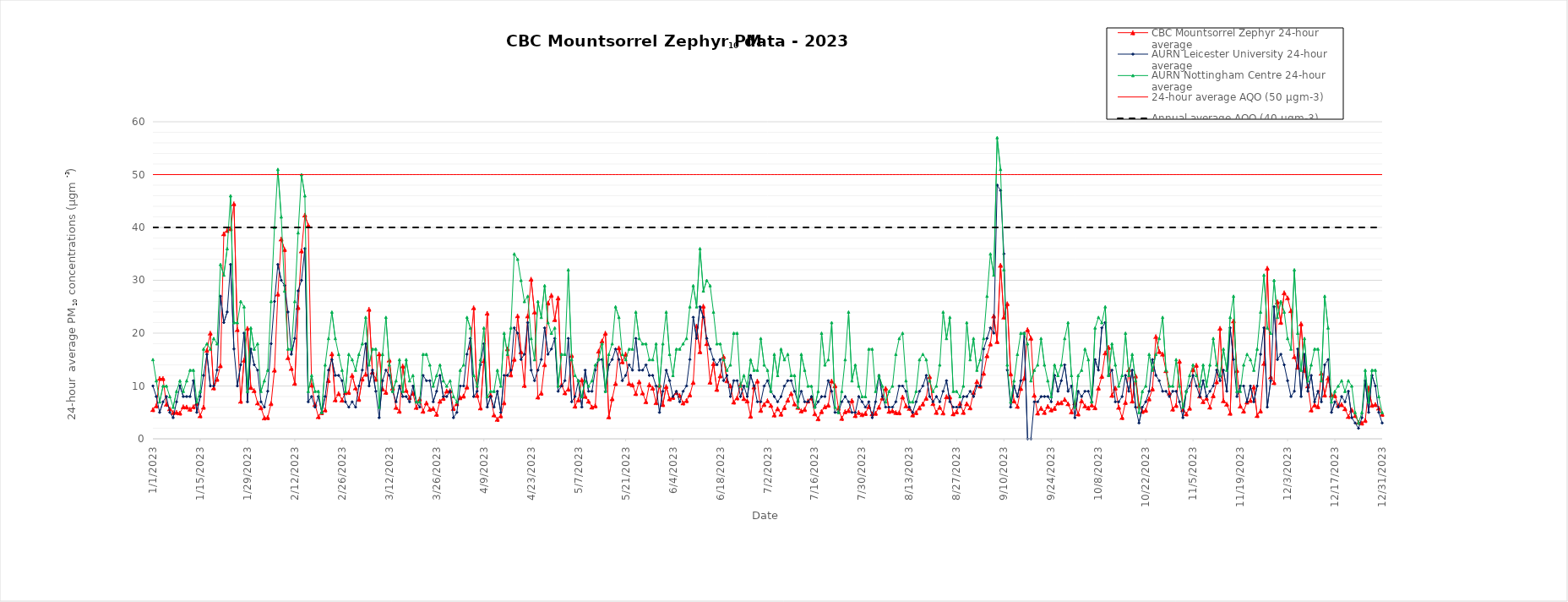
| Category | CBC Mountsorrel Zephyr 24-hour average | AURN Leicester University 24-hour average | AURN Nottingham Centre 24-hour average | 24-hour average AQO (50 µgm-3) | Annual average AQO (40 µgm-3) |
|---|---|---|---|---|---|
| 1/1/23 | 5.53 | 10 | 15 | 50 | 40 |
| 1/2/23 | 6.25 | 8 | 11 | 50 | 40 |
| 1/3/23 | 11.44 | 5 | 7 | 50 | 40 |
| 1/4/23 | 11.42 | 7 | 10 | 50 | 40 |
| 1/5/23 | 6.55 | 8 | 10 | 50 | 40 |
| 1/6/23 | 5.69 | 5 | 8 | 50 | 40 |
| 1/7/23 | 4.98 | 4 | 6 | 50 | 40 |
| 1/8/23 | 5.01 | 7 | 9 | 50 | 40 |
| 1/9/23 | 4.88 | 10 | 11 | 50 | 40 |
| 1/10/23 | 6.07 | 8 | 9 | 50 | 40 |
| 1/11/23 | 6.02 | 8 | 11 | 50 | 40 |
| 1/12/23 | 5.62 | 8 | 13 | 50 | 40 |
| 1/13/23 | 6.07 | 11 | 13 | 50 | 40 |
| 1/14/23 | 6.75 | 5 | 7 | 50 | 40 |
| 1/15/23 | 4.38 | 8 | 9 | 50 | 40 |
| 1/16/23 | 5.99 | 12 | 17 | 50 | 40 |
| 1/17/23 | 16.75 | 16 | 18 | 50 | 40 |
| 1/18/23 | 20 | 10 | 17 | 50 | 40 |
| 1/19/23 | 9.65 | 10 | 19 | 50 | 40 |
| 1/20/23 | 11.28 | 13 | 18 | 50 | 40 |
| 1/21/23 | 13.85 | 27 | 33 | 50 | 40 |
| 1/22/23 | 38.8 | 22 | 31 | 50 | 40 |
| 1/23/23 | 39.44 | 24 | 36 | 50 | 40 |
| 1/24/23 | 39.76 | 33 | 46 | 50 | 40 |
| 1/25/23 | 44.48 | 17 | 22 | 50 | 40 |
| 1/26/23 | 20.67 | 10 | 22 | 50 | 40 |
| 1/27/23 | 7.11 | 14 | 26 | 50 | 40 |
| 1/28/23 | 14.89 | 20 | 25 | 50 | 40 |
| 1/29/23 | 20.91 | 7 | 9 | 50 | 40 |
| 1/30/23 | 9.73 | 17 | 21 | 50 | 40 |
| 1/31/23 | 9.12 | 14 | 17 | 50 | 40 |
| 2/1/23 | 6.79 | 13 | 18 | 50 | 40 |
| 2/2/23 | 5.89 | 7 | 9 | 50 | 40 |
| 2/3/23 | 3.97 | 6 | 11 | 50 | 40 |
| 2/4/23 | 4.03 | 9 | 13 | 50 | 40 |
| 2/5/23 | 6.68 | 18 | 26 | 50 | 40 |
| 2/6/23 | 13.01 | 26 | 40 | 50 | 40 |
| 2/7/23 | 27.4 | 33 | 51 | 50 | 40 |
| 2/8/23 | 37.82 | 30 | 42 | 50 | 40 |
| 2/9/23 | 35.82 | 29 | 28 | 50 | 40 |
| 2/10/23 | 15.36 | 24 | 17 | 50 | 40 |
| 2/11/23 | 13.33 | 16 | 17 | 50 | 40 |
| 2/12/23 | 10.51 | 19 | 26 | 50 | 40 |
| 2/13/23 | 24.87 | 28 | 39 | 50 | 40 |
| 2/14/23 | 35.57 | 30 | 50 | 50 | 40 |
| 2/15/23 | 42.34 | 36 | 46 | 50 | 40 |
| 2/16/23 | 40.42 | 7 | 9 | 50 | 40 |
| 2/17/23 | 10.17 | 8 | 12 | 50 | 40 |
| 2/18/23 | 6.52 | 6 | 9 | 50 | 40 |
| 2/19/23 | 4.2 | 8 | 9 | 50 | 40 |
| 2/20/23 | 4.96 | 5 | 5 | 50 | 40 |
| 2/21/23 | 5.48 | 8 | 14 | 50 | 40 |
| 2/22/23 | 11.04 | 13 | 19 | 50 | 40 |
| 2/23/23 | 16.09 | 15 | 24 | 50 | 40 |
| 2/24/23 | 7.39 | 12 | 19 | 50 | 40 |
| 2/25/23 | 8.57 | 12 | 16 | 50 | 40 |
| 2/26/23 | 7.34 | 11 | 13 | 50 | 40 |
| 2/27/23 | 8.75 | 7 | 9 | 50 | 40 |
| 2/28/23 | 8.79 | 6 | 16 | 50 | 40 |
| 3/1/23 | 12.01 | 7 | 15 | 50 | 40 |
| 3/2/23 | 9.64 | 6 | 13 | 50 | 40 |
| 3/3/23 | 7.48 | 10 | 16 | 50 | 40 |
| 3/4/23 | 11.32 | 13 | 18 | 50 | 40 |
| 3/5/23 | 12.23 | 18 | 23 | 50 | 40 |
| 3/6/23 | 24.52 | 10 | 14 | 50 | 40 |
| 3/7/23 | 12.65 | 13 | 17 | 50 | 40 |
| 3/8/23 | 11.29 | 9 | 17 | 50 | 40 |
| 3/9/23 | 16.07 | 4 | 6 | 50 | 40 |
| 3/10/23 | 9.47 | 11 | 16 | 50 | 40 |
| 3/11/23 | 8.81 | 13 | 23 | 50 | 40 |
| 3/12/23 | 14.9 | 12 | 14 | 50 | 40 |
| 3/13/23 | 9.61 | 9 | 9 | 50 | 40 |
| 3/14/23 | 5.96 | 7 | 11 | 50 | 40 |
| 3/15/23 | 5.23 | 10 | 15 | 50 | 40 |
| 3/16/23 | 13.78 | 8 | 9 | 50 | 40 |
| 3/17/23 | 9.17 | 8 | 15 | 50 | 40 |
| 3/18/23 | 7.81 | 7 | 11 | 50 | 40 |
| 3/19/23 | 8.62 | 10 | 12 | 50 | 40 |
| 3/20/23 | 5.96 | 7 | 7 | 50 | 40 |
| 3/21/23 | 7.54 | 6 | 7 | 50 | 40 |
| 3/22/23 | 5.23 | 12 | 16 | 50 | 40 |
| 3/23/23 | 6.81 | 11 | 16 | 50 | 40 |
| 3/24/23 | 5.59 | 11 | 14 | 50 | 40 |
| 3/25/23 | 5.74 | 7 | 10 | 50 | 40 |
| 3/26/23 | 4.66 | 9 | 12 | 50 | 40 |
| 3/27/23 | 7.13 | 12 | 14 | 50 | 40 |
| 3/28/23 | 7.66 | 8 | 11 | 50 | 40 |
| 3/29/23 | 9.06 | 8 | 10 | 50 | 40 |
| 3/30/23 | 9.1 | 9 | 11 | 50 | 40 |
| 3/31/23 | 5.75 | 4 | 8 | 50 | 40 |
| 4/1/23 | 6.66 | 5 | 7 | 50 | 40 |
| 4/2/23 | 7.8 | 10 | 13 | 50 | 40 |
| 4/3/23 | 8.1 | 10 | 14 | 50 | 40 |
| 4/4/23 | 9.82 | 16 | 23 | 50 | 40 |
| 4/5/23 | 17.27 | 19 | 21 | 50 | 40 |
| 4/6/23 | 24.8 | 8 | 12 | 50 | 40 |
| 4/7/23 | 8.22 | 9 | 10 | 50 | 40 |
| 4/8/23 | 5.85 | 14 | 15 | 50 | 40 |
| 4/9/23 | 14.76 | 18 | 21 | 50 | 40 |
| 4/10/23 | 23.76 | 6 | 8 | 50 | 40 |
| 4/11/23 | 8.28 | 8 | 9 | 50 | 40 |
| 4/12/23 | 4.54 | 6 | 9 | 50 | 40 |
| 4/13/23 | 3.7 | 9 | 13 | 50 | 40 |
| 4/14/23 | 4.35 | 5 | 10 | 50 | 40 |
| 4/15/23 | 6.83 | 12 | 20 | 50 | 40 |
| 4/16/23 | 17.04 | 12 | 16 | 50 | 40 |
| 4/17/23 | 12.11 | 13 | 21 | 50 | 40 |
| 4/18/23 | 15.08 | 21 | 35 | 50 | 40 |
| 4/19/23 | 23.27 | 20 | 34 | 50 | 40 |
| 4/20/23 | 16.49 | 15 | 30 | 50 | 40 |
| 4/21/23 | 10.12 | 16 | 26 | 50 | 40 |
| 4/22/23 | 23.26 | 22 | 27 | 50 | 40 |
| 4/23/23 | 30.21 | 13 | 19 | 50 | 40 |
| 4/24/23 | 23.99 | 11 | 15 | 50 | 40 |
| 4/25/23 | 7.91 | 13 | 26 | 50 | 40 |
| 4/26/23 | 8.66 | 15 | 23 | 50 | 40 |
| 4/27/23 | 14.04 | 21 | 29 | 50 | 40 |
| 4/28/23 | 25.71 | 16 | 22 | 50 | 40 |
| 4/29/23 | 27.17 | 17 | 20 | 50 | 40 |
| 4/30/23 | 22.58 | 19 | 21 | 50 | 40 |
| 5/1/23 | 26.66 | 9 | 10 | 50 | 40 |
| 5/2/23 | 10.23 | 10 | 16 | 50 | 40 |
| 5/3/23 | 8.71 | 11 | 16 | 50 | 40 |
| 5/4/23 | 9.4 | 19 | 32 | 50 | 40 |
| 5/5/23 | 15.78 | 7 | 15 | 50 | 40 |
| 5/6/23 | 6.19 | 8 | 12 | 50 | 40 |
| 5/7/23 | 7.39 | 11 | 11 | 50 | 40 |
| 5/8/23 | 11.18 | 6 | 8 | 50 | 40 |
| 5/9/23 | 8.06 | 13 | 11 | 50 | 40 |
| 5/10/23 | 7.12 | 9 | 10 | 50 | 40 |
| 5/11/23 | 6.02 | 9 | 11 | 50 | 40 |
| 5/12/23 | 6.26 | 13 | 14 | 50 | 40 |
| 5/13/23 | 16.59 | 15 | 15 | 50 | 40 |
| 5/14/23 | 18.51 | 15 | 18 | 50 | 40 |
| 5/15/23 | 19.99 | 9 | 9 | 50 | 40 |
| 5/16/23 | 4.17 | 14 | 16 | 50 | 40 |
| 5/17/23 | 7.59 | 15 | 18 | 50 | 40 |
| 5/18/23 | 10.47 | 17 | 25 | 50 | 40 |
| 5/19/23 | 17.22 | 15 | 23 | 50 | 40 |
| 5/20/23 | 14.59 | 11 | 16 | 50 | 40 |
| 5/21/23 | 16.04 | 12 | 15 | 50 | 40 |
| 5/22/23 | 10.48 | 14 | 17 | 50 | 40 |
| 5/23/23 | 10.21 | 13 | 17 | 50 | 40 |
| 5/24/23 | 8.58 | 19 | 24 | 50 | 40 |
| 5/25/23 | 10.81 | 13 | 19 | 50 | 40 |
| 5/26/23 | 8.69 | 13 | 18 | 50 | 40 |
| 5/27/23 | 7.03 | 14 | 18 | 50 | 40 |
| 5/28/23 | 10.25 | 12 | 15 | 50 | 40 |
| 5/29/23 | 9.6 | 12 | 15 | 50 | 40 |
| 5/30/23 | 6.86 | 10 | 18 | 50 | 40 |
| 5/31/23 | 10.15 | 5 | 10 | 50 | 40 |
| 6/1/23 | 6.49 | 9 | 18 | 50 | 40 |
| 6/2/23 | 9.9 | 13 | 24 | 50 | 40 |
| 6/3/23 | 7.58 | 11 | 16 | 50 | 40 |
| 6/4/23 | 7.85 | 8 | 12 | 50 | 40 |
| 6/5/23 | 8.77 | 9 | 17 | 50 | 40 |
| 6/6/23 | 8.22 | 7 | 17 | 50 | 40 |
| 6/7/23 | 6.79 | 9 | 18 | 50 | 40 |
| 6/8/23 | 7.24 | 10 | 19 | 50 | 40 |
| 6/9/23 | 8.32 | 15 | 25 | 50 | 40 |
| 6/10/23 | 10.68 | 23 | 29 | 50 | 40 |
| 6/11/23 | 21.33 | 19 | 25 | 50 | 40 |
| 6/12/23 | 16.5 | 25 | 36 | 50 | 40 |
| 6/13/23 | 25.1 | 23 | 28 | 50 | 40 |
| 6/14/23 | 18.02 | 19 | 30 | 50 | 40 |
| 6/15/23 | 10.73 | 17 | 29 | 50 | 40 |
| 6/16/23 | 14.24 | 15 | 24 | 50 | 40 |
| 6/17/23 | 9.36 | 14 | 18 | 50 | 40 |
| 6/18/23 | 11.93 | 15 | 18 | 50 | 40 |
| 6/19/23 | 15.56 | 11 | 15 | 50 | 40 |
| 6/20/23 | 10.99 | 12 | 13 | 50 | 40 |
| 6/21/23 | 10.05 | 8 | 14 | 50 | 40 |
| 6/22/23 | 6.96 | 11 | 20 | 50 | 40 |
| 6/23/23 | 7.75 | 11 | 20 | 50 | 40 |
| 6/24/23 | 10.29 | 8 | 10 | 50 | 40 |
| 6/25/23 | 7.62 | 10 | 12 | 50 | 40 |
| 6/26/23 | 7.17 | 8 | 10 | 50 | 40 |
| 6/27/23 | 4.28 | 12 | 15 | 50 | 40 |
| 6/28/23 | 9.81 | 10 | 13 | 50 | 40 |
| 6/29/23 | 10.94 | 7 | 13 | 50 | 40 |
| 6/30/23 | 5.39 | 7 | 19 | 50 | 40 |
| 7/1/23 | 6.51 | 10 | 14 | 50 | 40 |
| 7/2/23 | 7.21 | 11 | 13 | 50 | 40 |
| 7/3/23 | 6.32 | 9 | 9 | 50 | 40 |
| 7/4/23 | 4.52 | 8 | 16 | 50 | 40 |
| 7/5/23 | 5.7 | 7 | 12 | 50 | 40 |
| 7/6/23 | 4.68 | 8 | 17 | 50 | 40 |
| 7/7/23 | 5.93 | 10 | 15 | 50 | 40 |
| 7/8/23 | 7.33 | 11 | 16 | 50 | 40 |
| 7/9/23 | 8.57 | 11 | 12 | 50 | 40 |
| 7/10/23 | 6.62 | 9 | 12 | 50 | 40 |
| 7/11/23 | 5.97 | 7 | 6 | 50 | 40 |
| 7/12/23 | 5.29 | 9 | 16 | 50 | 40 |
| 7/13/23 | 5.56 | 7 | 13 | 50 | 40 |
| 7/14/23 | 7.17 | 7 | 10 | 50 | 40 |
| 7/15/23 | 7.71 | 8 | 10 | 50 | 40 |
| 7/16/23 | 4.76 | 6 | 6 | 50 | 40 |
| 7/17/23 | 3.81 | 7 | 9 | 50 | 40 |
| 7/18/23 | 5.17 | 8 | 20 | 50 | 40 |
| 7/19/23 | 6.07 | 8 | 14 | 50 | 40 |
| 7/20/23 | 6.38 | 11 | 15 | 50 | 40 |
| 7/21/23 | 10.95 | 9 | 22 | 50 | 40 |
| 7/22/23 | 10.05 | 5 | 6 | 50 | 40 |
| 7/23/23 | 5.8 | 5 | 5 | 50 | 40 |
| 7/24/23 | 3.87 | 7 | 9 | 50 | 40 |
| 7/25/23 | 5.15 | 8 | 15 | 50 | 40 |
| 7/26/23 | 5.35 | 7 | 24 | 50 | 40 |
| 7/27/23 | 7.25 | 5 | 11 | 50 | 40 |
| 7/28/23 | 4.4 | 5 | 14 | 50 | 40 |
| 7/29/23 | 4.99 | 8 | 10 | 50 | 40 |
| 7/30/23 | 4.59 | 7 | 8 | 50 | 40 |
| 7/31/23 | 4.81 | 6 | 8 | 50 | 40 |
| 8/1/23 | 6.11 | 7 | 17 | 50 | 40 |
| 8/2/23 | 4.73 | 4 | 17 | 50 | 40 |
| 8/3/23 | 4.83 | 7 | 9 | 50 | 40 |
| 8/4/23 | 6 | 12 | 12 | 50 | 40 |
| 8/5/23 | 7.73 | 8 | 10 | 50 | 40 |
| 8/6/23 | 9.55 | 6 | 7 | 50 | 40 |
| 8/7/23 | 5.21 | 6 | 9 | 50 | 40 |
| 8/8/23 | 5.31 | 6 | 10 | 50 | 40 |
| 8/9/23 | 4.98 | 7 | 16 | 50 | 40 |
| 8/10/23 | 4.94 | 10 | 19 | 50 | 40 |
| 8/11/23 | 7.91 | 10 | 20 | 50 | 40 |
| 8/12/23 | 6.23 | 9 | 11 | 50 | 40 |
| 8/13/23 | 5.75 | 6 | 7 | 50 | 40 |
| 8/14/23 | 4.54 | 5 | 7 | 50 | 40 |
| 8/15/23 | 4.96 | 7 | 9 | 50 | 40 |
| 8/16/23 | 5.87 | 9 | 15 | 50 | 40 |
| 8/17/23 | 6.62 | 10 | 16 | 50 | 40 |
| 8/18/23 | 7.7 | 12 | 15 | 50 | 40 |
| 8/19/23 | 11.78 | 8 | 11 | 50 | 40 |
| 8/20/23 | 6.68 | 7 | 9 | 50 | 40 |
| 8/21/23 | 5.02 | 8 | 10 | 50 | 40 |
| 8/22/23 | 5.98 | 7 | 14 | 50 | 40 |
| 8/23/23 | 4.91 | 9 | 24 | 50 | 40 |
| 8/24/23 | 7.98 | 11 | 19 | 50 | 40 |
| 8/25/23 | 7.92 | 7 | 23 | 50 | 40 |
| 8/26/23 | 4.74 | 6 | 9 | 50 | 40 |
| 8/27/23 | 5.12 | 6 | 9 | 50 | 40 |
| 8/28/23 | 6.71 | 6 | 8 | 50 | 40 |
| 8/29/23 | 5.02 | 8 | 10 | 50 | 40 |
| 8/30/23 | 6.65 | 8 | 22 | 50 | 40 |
| 8/31/23 | 5.88 | 9 | 15 | 50 | 40 |
| 9/1/23 | 8.75 | 8 | 19 | 50 | 40 |
| 9/2/23 | 10.84 | 10 | 13 | 50 | 40 |
| 9/3/23 | 9.99 | 10 | 15 | 50 | 40 |
| 9/4/23 | 12.41 | 17 | 19 | 50 | 40 |
| 9/5/23 | 15.74 | 19 | 27 | 50 | 40 |
| 9/6/23 | 17.96 | 21 | 35 | 50 | 40 |
| 9/7/23 | 23.26 | 20 | 31 | 50 | 40 |
| 9/8/23 | 18.41 | 48 | 57 | 50 | 40 |
| 9/9/23 | 32.85 | 47 | 51 | 50 | 40 |
| 9/10/23 | 23.04 | 35 | 32 | 50 | 40 |
| 9/11/23 | 25.57 | 13 | 14 | 50 | 40 |
| 9/12/23 | 12.29 | 6 | 7 | 50 | 40 |
| 9/13/23 | 7.18 | 10 | 11 | 50 | 40 |
| 9/14/23 | 6.15 | 8 | 16 | 50 | 40 |
| 9/15/23 | 9.54 | 11 | 20 | 50 | 40 |
| 9/16/23 | 11.47 | 20 | 20 | 50 | 40 |
| 9/17/23 | 20.66 | 0 | 18 | 50 | 40 |
| 9/18/23 | 19.05 | 0 | 11 | 50 | 40 |
| 9/19/23 | 8.24 | 7 | 13 | 50 | 40 |
| 9/20/23 | 4.89 | 7 | 14 | 50 | 40 |
| 9/21/23 | 5.79 | 8 | 19 | 50 | 40 |
| 9/22/23 | 5.01 | 8 | 14 | 50 | 40 |
| 9/23/23 | 6.15 | 8 | 11 | 50 | 40 |
| 9/24/23 | 5.49 | 7 | 8 | 50 | 40 |
| 9/25/23 | 5.77 | 12 | 14 | 50 | 40 |
| 9/26/23 | 6.81 | 9 | 12 | 50 | 40 |
| 9/27/23 | 6.84 | 11 | 14 | 50 | 40 |
| 9/28/23 | 7.46 | 14 | 19 | 50 | 40 |
| 9/29/23 | 6.64 | 9 | 22 | 50 | 40 |
| 9/30/23 | 5.11 | 10 | 12 | 50 | 40 |
| 10/1/23 | 6.83 | 4 | 6 | 50 | 40 |
| 10/2/23 | 4.71 | 9 | 12 | 50 | 40 |
| 10/3/23 | 7.2 | 8 | 13 | 50 | 40 |
| 10/4/23 | 6.23 | 9 | 17 | 50 | 40 |
| 10/5/23 | 5.84 | 9 | 15 | 50 | 40 |
| 10/6/23 | 6.4 | 7 | 7 | 50 | 40 |
| 10/7/23 | 5.9 | 15 | 21 | 50 | 40 |
| 10/8/23 | 9.61 | 13 | 23 | 50 | 40 |
| 10/9/23 | 11.84 | 21 | 22 | 50 | 40 |
| 10/10/23 | 16.27 | 22 | 25 | 50 | 40 |
| 10/11/23 | 17.31 | 12 | 12 | 50 | 40 |
| 10/12/23 | 8.24 | 13 | 18 | 50 | 40 |
| 10/13/23 | 9.6 | 7 | 14 | 50 | 40 |
| 10/14/23 | 5.98 | 7 | 10 | 50 | 40 |
| 10/15/23 | 4.04 | 8 | 12 | 50 | 40 |
| 10/16/23 | 6.9 | 12 | 20 | 50 | 40 |
| 10/17/23 | 13.1 | 9 | 12 | 50 | 40 |
| 10/18/23 | 7.16 | 13 | 16 | 50 | 40 |
| 10/19/23 | 11.9 | 6 | 11 | 50 | 40 |
| 10/20/23 | 6.21 | 3 | 5 | 50 | 40 |
| 10/21/23 | 5.2 | 6 | 9 | 50 | 40 |
| 10/22/23 | 5.42 | 7 | 10 | 50 | 40 |
| 10/23/23 | 7.58 | 9 | 16 | 50 | 40 |
| 10/24/23 | 9.46 | 15 | 13 | 50 | 40 |
| 10/25/23 | 19.35 | 12 | 16 | 50 | 40 |
| 10/26/23 | 16.53 | 11 | 19 | 50 | 40 |
| 10/27/23 | 16.03 | 9 | 23 | 50 | 40 |
| 10/28/23 | 12.89 | 9 | 13 | 50 | 40 |
| 10/29/23 | 8.66 | 8 | 10 | 50 | 40 |
| 10/30/23 | 5.63 | 9 | 10 | 50 | 40 |
| 10/31/23 | 6.32 | 9 | 15 | 50 | 40 |
| 11/1/23 | 14.67 | 7 | 10 | 50 | 40 |
| 11/2/23 | 5.53 | 4 | 6 | 50 | 40 |
| 11/3/23 | 4.72 | 9 | 9 | 50 | 40 |
| 11/4/23 | 5.82 | 10 | 12 | 50 | 40 |
| 11/5/23 | 13.09 | 12 | 14 | 50 | 40 |
| 11/6/23 | 13.92 | 10 | 12 | 50 | 40 |
| 11/7/23 | 8.11 | 8 | 10 | 50 | 40 |
| 11/8/23 | 7.05 | 11 | 14 | 50 | 40 |
| 11/9/23 | 7.67 | 8 | 10 | 50 | 40 |
| 11/10/23 | 6 | 9 | 14 | 50 | 40 |
| 11/11/23 | 8.17 | 10 | 19 | 50 | 40 |
| 11/12/23 | 10.8 | 13 | 14 | 50 | 40 |
| 11/13/23 | 20.92 | 11 | 12 | 50 | 40 |
| 11/14/23 | 7.22 | 13 | 17 | 50 | 40 |
| 11/15/23 | 6.55 | 9 | 13 | 50 | 40 |
| 11/16/23 | 4.86 | 21 | 23 | 50 | 40 |
| 11/17/23 | 22.31 | 15 | 27 | 50 | 40 |
| 11/18/23 | 12.93 | 8 | 9 | 50 | 40 |
| 11/19/23 | 6.2 | 10 | 9 | 50 | 40 |
| 11/20/23 | 5.26 | 10 | 14 | 50 | 40 |
| 11/21/23 | 6.98 | 7 | 16 | 50 | 40 |
| 11/22/23 | 7.27 | 10 | 15 | 50 | 40 |
| 11/23/23 | 9.82 | 7 | 13 | 50 | 40 |
| 11/24/23 | 4.41 | 10 | 17 | 50 | 40 |
| 11/25/23 | 5.27 | 16 | 24 | 50 | 40 |
| 11/26/23 | 14.28 | 21 | 31 | 50 | 40 |
| 11/27/23 | 32.29 | 6 | 21 | 50 | 40 |
| 11/28/23 | 11.73 | 11 | 20 | 50 | 40 |
| 11/29/23 | 10.64 | 25 | 30 | 50 | 40 |
| 11/30/23 | 25.93 | 15 | 23 | 50 | 40 |
| 12/1/23 | 22.05 | 16 | 26 | 50 | 40 |
| 12/2/23 | 27.64 | 14 | 24 | 50 | 40 |
| 12/3/23 | 26.68 | 11 | 19 | 50 | 40 |
| 12/4/23 | 24.25 | 8 | 17 | 50 | 40 |
| 12/5/23 | 15.55 | 9 | 32 | 50 | 40 |
| 12/6/23 | 13.55 | 17 | 20 | 50 | 40 |
| 12/7/23 | 21.77 | 8 | 13 | 50 | 40 |
| 12/8/23 | 12.95 | 16 | 19 | 50 | 40 |
| 12/9/23 | 10.02 | 9 | 11 | 50 | 40 |
| 12/10/23 | 5.47 | 12 | 14 | 50 | 40 |
| 12/11/23 | 6.41 | 7 | 17 | 50 | 40 |
| 12/12/23 | 6.1 | 9 | 17 | 50 | 40 |
| 12/13/23 | 12.4 | 7 | 11 | 50 | 40 |
| 12/14/23 | 8.3 | 14 | 27 | 50 | 40 |
| 12/15/23 | 11.51 | 15 | 21 | 50 | 40 |
| 12/16/23 | 8.3 | 5 | 7 | 50 | 40 |
| 12/17/23 | 8.17 | 7 | 9 | 50 | 40 |
| 12/18/23 | 6.35 | 6 | 10 | 50 | 40 |
| 12/19/23 | 6.48 | 8 | 11 | 50 | 40 |
| 12/20/23 | 5.7 | 7 | 9 | 50 | 40 |
| 12/21/23 | 4.23 | 9 | 11 | 50 | 40 |
| 12/22/23 | 5.49 | 4 | 10 | 50 | 40 |
| 12/23/23 | 4.4 | 3 | 5 | 50 | 40 |
| 12/24/23 | 3.13 | 2 | 3 | 50 | 40 |
| 12/25/23 | 2.99 | 4 | 5 | 50 | 40 |
| 12/26/23 | 3.48 | 11 | 13 | 50 | 40 |
| 12/27/23 | 9.67 | 5 | 7 | 50 | 40 |
| 12/28/23 | 6.36 | 12 | 13 | 50 | 40 |
| 12/29/23 | 6.5 | 10 | 13 | 50 | 40 |
| 12/30/23 | 5.82 | 5 | 8 | 50 | 40 |
| 12/31/23 | 4.66 | 3 | 5 | 50 | 40 |